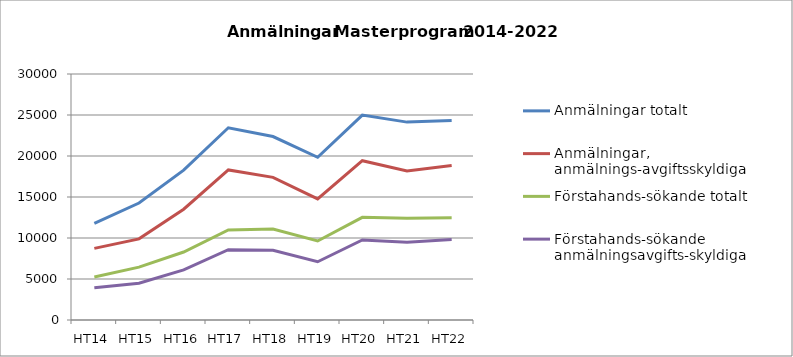
| Category | Anmälningar totalt | Anmälningar, anmälnings-avgiftsskyldiga | Förstahands-sökande totalt | Förstahands-sökande anmälningsavgifts-skyldiga |
|---|---|---|---|---|
| HT14 | 11772 | 8736 | 5238 | 3922 |
| HT15 | 14264 | 9895 | 6444 | 4492 |
| HT16 | 18267 | 13514 | 8292 | 6109 |
| HT17 | 23441 | 18305 | 10976 | 8567 |
| HT18 | 22373 | 17395 | 11084 | 8511 |
| HT19 | 19841 | 14762 | 9639 | 7105 |
| HT20 | 24988 | 19430 | 12518 | 9766 |
| HT21 | 24133 | 18187 | 12418 | 9485 |
| HT22 | 24325 | 18835 | 12458 | 9803 |